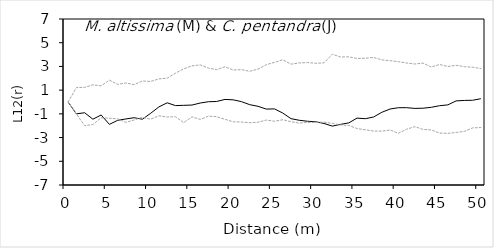
| Category | L12(r) | E12- | E12+ |
|---|---|---|---|
| 0.0 | 0 | 0 | 0 |
| 1.0 | -1 | -1 | 1.217 |
| 2.0 | -0.906 | -2 | 1.235 |
| 3.0 | -1.45 | -1.899 | 1.446 |
| 4.0 | -1.096 | -1.331 | 1.367 |
| 5.0 | -1.888 | -1.368 | 1.844 |
| 6.0 | -1.545 | -1.423 | 1.491 |
| 7.0 | -1.429 | -1.717 | 1.602 |
| 8.0 | -1.324 | -1.515 | 1.467 |
| 9.0 | -1.452 | -1.292 | 1.773 |
| 10.0 | -0.951 | -1.451 | 1.729 |
| 11.0 | -0.413 | -1.158 | 1.951 |
| 12.0 | -0.069 | -1.271 | 2.008 |
| 13.0 | -0.303 | -1.24 | 2.43 |
| 14.0 | -0.281 | -1.743 | 2.794 |
| 15.0 | -0.258 | -1.253 | 3.047 |
| 16.0 | -0.088 | -1.467 | 3.13 |
| 17.0 | 0.023 | -1.195 | 2.856 |
| 18.0 | 0.046 | -1.241 | 2.728 |
| 19.0 | 0.216 | -1.461 | 2.972 |
| 20.0 | 0.182 | -1.67 | 2.696 |
| 21.0 | 0.03 | -1.689 | 2.729 |
| 22.0 | -0.224 | -1.748 | 2.594 |
| 23.0 | -0.363 | -1.706 | 2.769 |
| 24.0 | -0.598 | -1.522 | 3.144 |
| 25.0 | -0.582 | -1.625 | 3.346 |
| 26.0 | -0.93 | -1.495 | 3.56 |
| 27.0 | -1.405 | -1.663 | 3.192 |
| 28.0 | -1.541 | -1.781 | 3.293 |
| 29.0 | -1.624 | -1.716 | 3.327 |
| 30.0 | -1.668 | -1.716 | 3.267 |
| 31.0 | -1.81 | -1.697 | 3.298 |
| 32.0 | -2.034 | -1.803 | 4.027 |
| 33.0 | -1.886 | -1.935 | 3.797 |
| 34.0 | -1.762 | -1.979 | 3.807 |
| 35.0 | -1.359 | -2.237 | 3.672 |
| 36.0 | -1.408 | -2.343 | 3.685 |
| 37.0 | -1.265 | -2.449 | 3.759 |
| 38.0 | -0.869 | -2.457 | 3.553 |
| 39.0 | -0.592 | -2.361 | 3.486 |
| 40.0 | -0.483 | -2.641 | 3.401 |
| 41.0 | -0.479 | -2.297 | 3.291 |
| 42.0 | -0.541 | -2.079 | 3.205 |
| 43.0 | -0.524 | -2.317 | 3.279 |
| 44.0 | -0.446 | -2.355 | 2.95 |
| 45.0 | -0.313 | -2.619 | 3.163 |
| 46.0 | -0.242 | -2.647 | 2.994 |
| 47.0 | 0.092 | -2.57 | 3.095 |
| 48.0 | 0.132 | -2.478 | 2.977 |
| 49.0 | 0.145 | -2.185 | 2.936 |
| 50.0 | 0.278 | -2.155 | 2.82 |